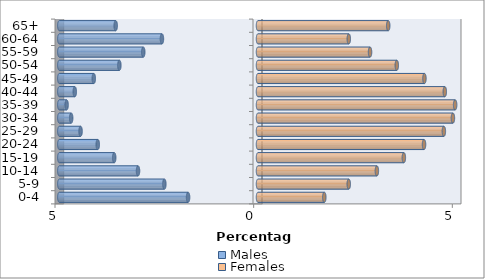
| Category | Males | Females |
|---|---|---|
| 0-4 | -1.76 | 1.669 |
| 5-9 | -2.357 | 2.284 |
| 10-14 | -3.02 | 2.992 |
| 15-19 | -3.619 | 3.671 |
| 20-24 | -4.033 | 4.179 |
| 25-29 | -4.466 | 4.678 |
| 30-34 | -4.702 | 4.906 |
| 35-39 | -4.818 | 4.962 |
| 40-44 | -4.611 | 4.701 |
| 45-49 | -4.133 | 4.189 |
| 50-54 | -3.489 | 3.493 |
| 55-59 | -2.888 | 2.82 |
| 60-64 | -2.418 | 2.285 |
| 65+ | -3.582 | 3.277 |